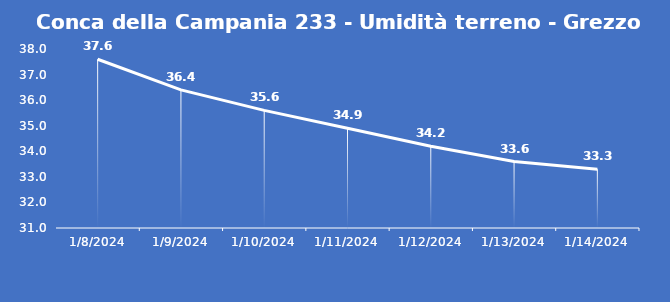
| Category | Conca della Campania 233 - Umidità terreno - Grezzo (%VWC) |
|---|---|
| 1/8/24 | 37.6 |
| 1/9/24 | 36.4 |
| 1/10/24 | 35.6 |
| 1/11/24 | 34.9 |
| 1/12/24 | 34.2 |
| 1/13/24 | 33.6 |
| 1/14/24 | 33.3 |